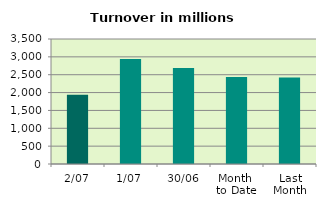
| Category | Series 0 |
|---|---|
| 2/07 | 1935.904 |
| 1/07 | 2938.428 |
| 30/06 | 2688.571 |
| Month 
to Date | 2437.166 |
| Last
Month | 2424.747 |